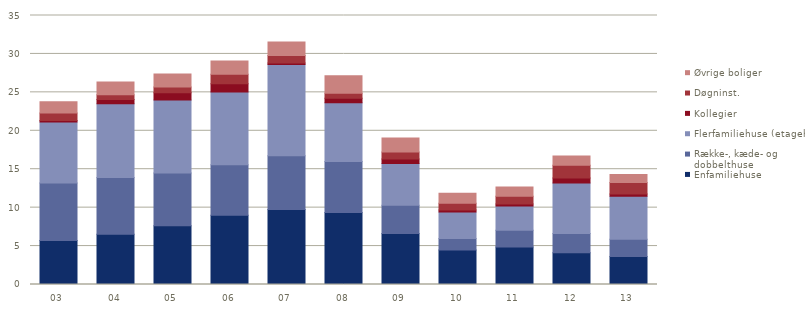
| Category | Enfamiliehuse | Række-, kæde- og dobbelthuse | Flerfamiliehuse (etagehuse) | Kollegier | Døgninst. | Øvrige boliger |
|---|---|---|---|---|---|---|
| 03 | 5726 | 7496 | 7908 | 213 | 984 | 1457 |
| 04 | 6526 | 7398 | 9598 | 557 | 608 | 1660 |
| 05 | 7639 | 6871 | 9509 | 945 | 741 | 1681 |
| 06 | 9002 | 6566 | 9478 | 1063 | 1251 | 1706 |
| 07 | 9773 | 6966 | 11875 | 201 | 974 | 1761 |
| 08 | 9381 | 6630 | 7650 | 588 | 648 | 2272 |
| 09 | 6633 | 3688 | 5428 | 564 | 919 | 1828 |
| 10 | 4474 | 1498 | 3454 | 279 | 862 | 1301 |
| 11 | 4868 | 2189 | 3146 | 278 | 1002 | 1215 |
| 12 | 4120 | 2512 | 6578 | 637 | 1675 | 1195 |
| 13 | 3651 | 2224 | 5594 | 318 | 1486 | 1055 |